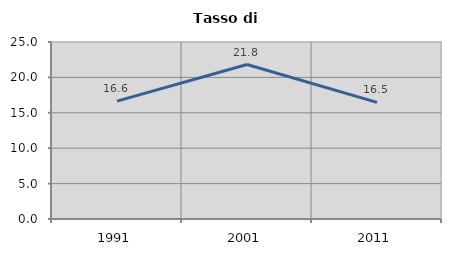
| Category | Tasso di disoccupazione   |
|---|---|
| 1991.0 | 16.649 |
| 2001.0 | 21.814 |
| 2011.0 | 16.473 |